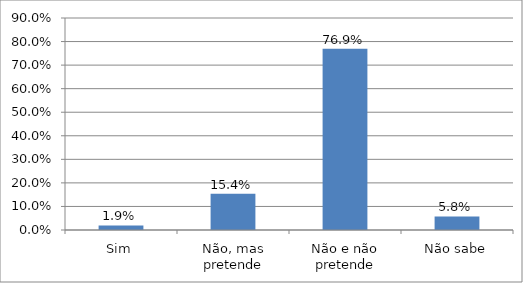
| Category | Series 0 |
|---|---|
| Sim | 0.019 |
| Não, mas pretende | 0.154 |
| Não e não pretende | 0.769 |
| Não sabe | 0.058 |